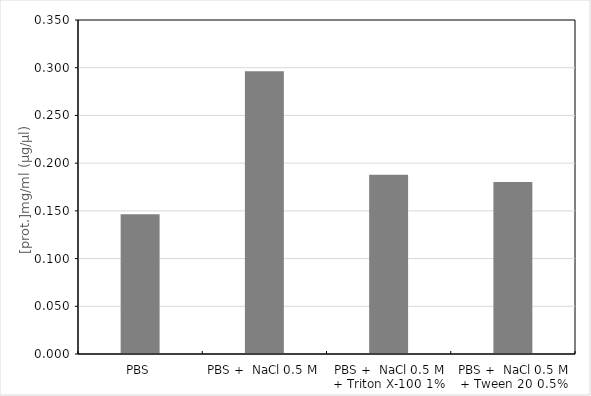
| Category | Series 0 |
|---|---|
| PBS | 0.146 |
| PBS +  NaCl 0.5 M | 0.296 |
| PBS +  NaCl 0.5 M + Triton X-100 1% | 0.188 |
| PBS +  NaCl 0.5 M + Tween 20 0.5% | 0.18 |